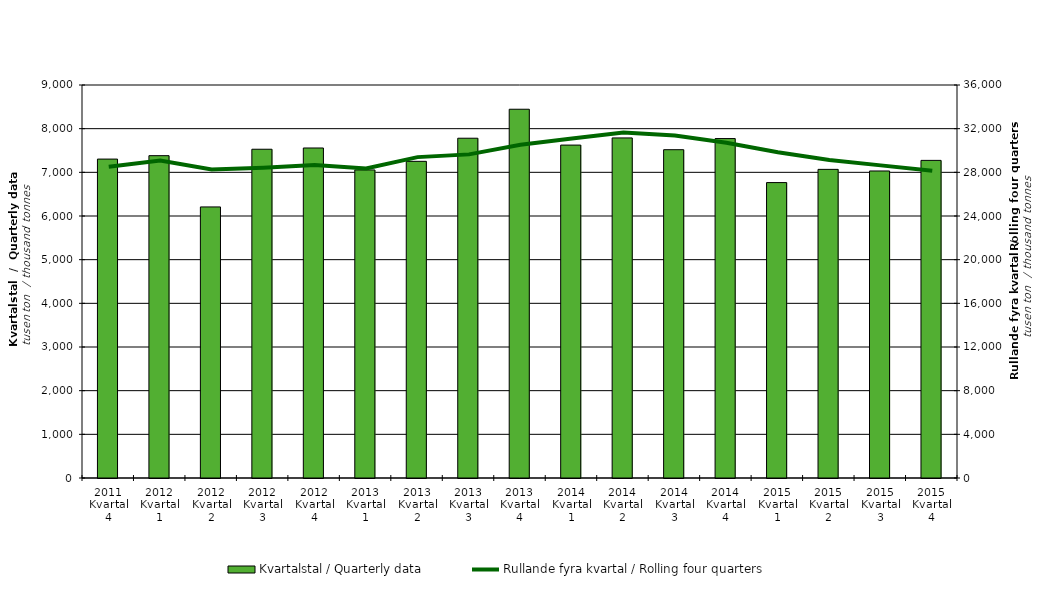
| Category | Kvartalstal / Quarterly data |
|---|---|
| 2011 Kvartal 4 | 7303.328 |
| 2012 Kvartal 1 | 7381.583 |
| 2012 Kvartal 2 | 6207.73 |
| 2012 Kvartal 3 | 7528.972 |
| 2012 Kvartal 4 | 7557.362 |
| 2013 Kvartal 1 | 7054.944 |
| 2013 Kvartal 2 | 7251.93 |
| 2013 Kvartal 3 | 7780.997 |
| 2013 Kvartal 4 | 8444.775 |
| 2014 Kvartal 1 | 7623.846 |
| 2014 Kvartal 2 | 7787.927 |
| 2014 Kvartal 3 | 7518.579 |
| 2014 Kvartal 4 | 7773.245 |
| 2015 Kvartal 1 | 6765.265 |
| 2015 Kvartal 2 | 7067.922 |
| 2015 Kvartal 3 | 7030.961 |
| 2015 Kvartal 4 | 7273.766 |